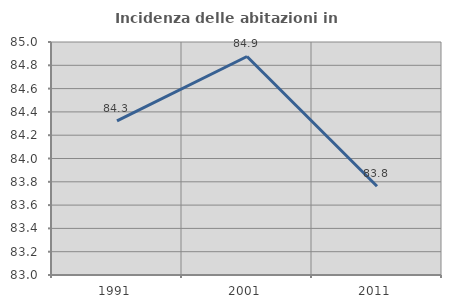
| Category | Incidenza delle abitazioni in proprietà  |
|---|---|
| 1991.0 | 84.323 |
| 2001.0 | 84.876 |
| 2011.0 | 83.761 |